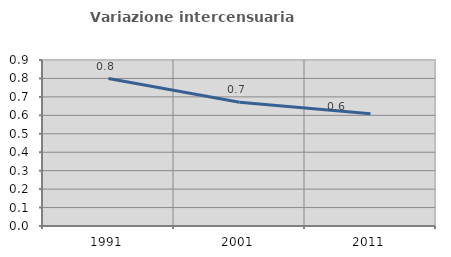
| Category | Variazione intercensuaria annua |
|---|---|
| 1991.0 | 0.799 |
| 2001.0 | 0.671 |
| 2011.0 | 0.608 |